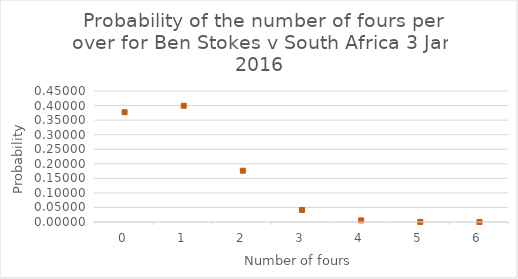
| Category | Series 1 |
|---|---|
| 0.0 | 0.377 |
| 1.0 | 0.399 |
| 2.0 | 0.176 |
| 3.0 | 0.041 |
| 4.0 | 0.005 |
| 5.0 | 0 |
| 6.0 | 0 |